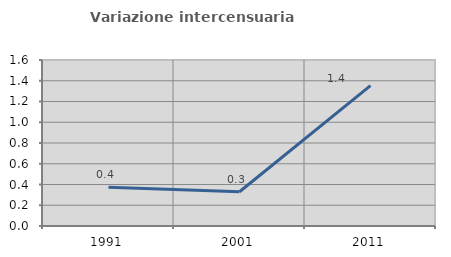
| Category | Variazione intercensuaria annua |
|---|---|
| 1991.0 | 0.375 |
| 2001.0 | 0.33 |
| 2011.0 | 1.354 |